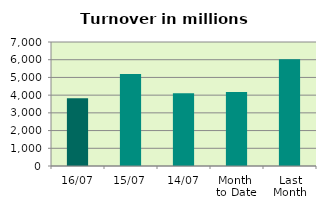
| Category | Series 0 |
|---|---|
| 16/07 | 3829.456 |
| 15/07 | 5197.653 |
| 14/07 | 4110.513 |
| Month 
to Date | 4174.887 |
| Last
Month | 6026.772 |